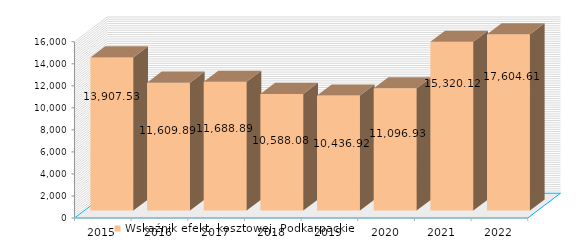
| Category | Wskaźnik efekt. kosztowej, Podkarpackie |
|---|---|
| 2015.0 | 13907.53 |
| 2016.0 | 11609.894 |
| 2017.0 | 11688.894 |
| 2018.0 | 10588.083 |
| 2019.0 | 10436.922 |
| 2020.0 | 11096.926 |
| 2021.0 | 15320.116 |
| 2022.0 | 17604.605 |